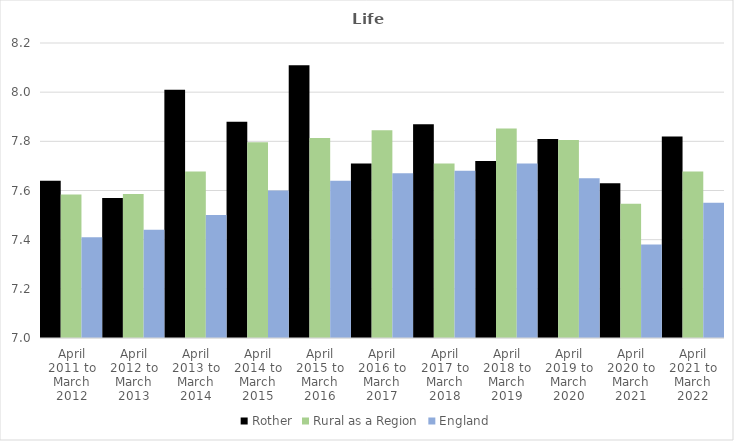
| Category | Rother | Rural as a Region | England |
|---|---|---|---|
| April 2011 to March 2012 | 7.64 | 7.584 | 7.41 |
| April 2012 to March 2013 | 7.57 | 7.586 | 7.44 |
| April 2013 to March 2014 | 8.01 | 7.677 | 7.5 |
| April 2014 to March 2015 | 7.88 | 7.797 | 7.6 |
| April 2015 to March 2016 | 8.11 | 7.813 | 7.64 |
| April 2016 to March 2017 | 7.71 | 7.845 | 7.67 |
| April 2017 to March 2018 | 7.87 | 7.71 | 7.68 |
| April 2018 to March 2019 | 7.72 | 7.852 | 7.71 |
| April 2019 to March 2020 | 7.81 | 7.806 | 7.65 |
| April 2020 to March 2021 | 7.63 | 7.546 | 7.38 |
| April 2021 to March 2022 | 7.82 | 7.677 | 7.55 |